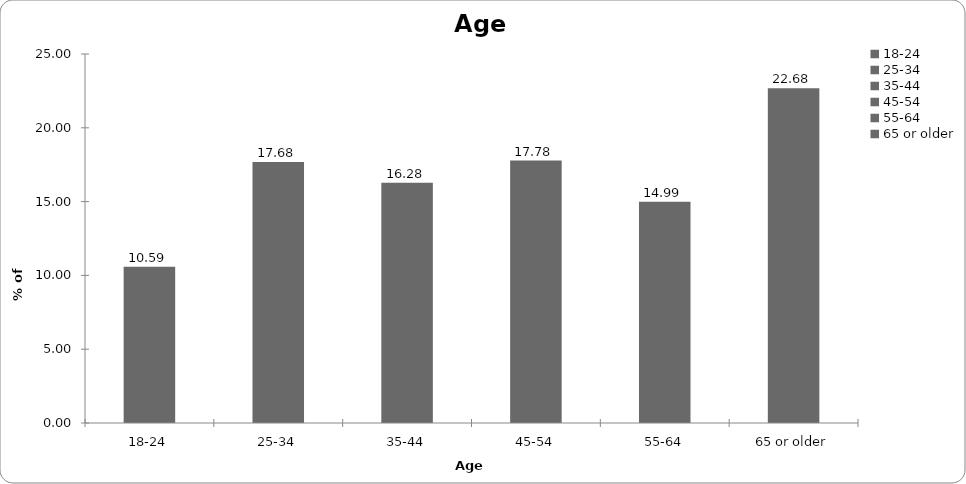
| Category | Age |
|---|---|
| 18-24 | 10.589 |
| 25-34 | 17.682 |
| 35-44 | 16.284 |
| 45-54 | 17.782 |
| 55-64 | 14.985 |
| 65 or older | 22.677 |